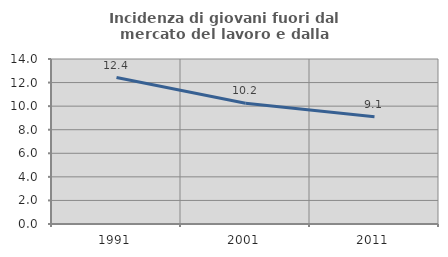
| Category | Incidenza di giovani fuori dal mercato del lavoro e dalla formazione  |
|---|---|
| 1991.0 | 12.428 |
| 2001.0 | 10.239 |
| 2011.0 | 9.091 |